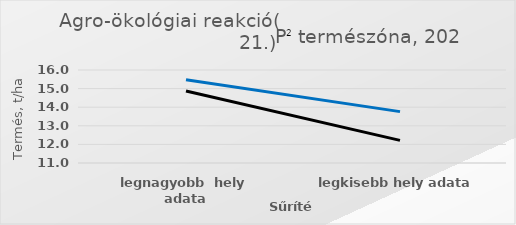
| Category | Series 0 | Series 1 | Series 2 | Series 3 | Series 4 | Series 5 | Series 6 | Series 7 | Series 8 | Series 9 | Series 10 | Series 11 | Series 12 |
|---|---|---|---|---|---|---|---|---|---|---|---|---|---|
| legnagyobb  hely adata | 15.473 |  |  |  |  |  |  |  |  |  |  |  | 14.869 |
| legkisebb hely adata | 13.761 |  |  |  |  |  |  |  |  |  |  |  | 12.217 |